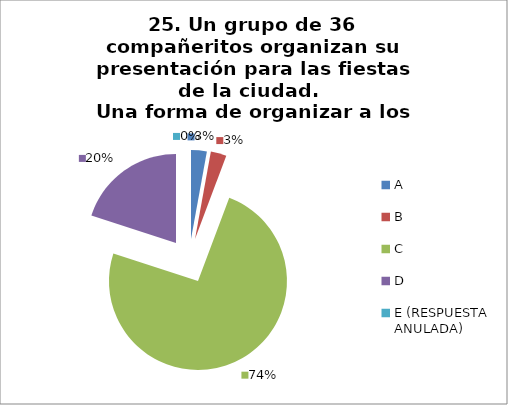
| Category | CANTIDAD DE RESPUESTAS PREGUNTA (25) | PORCENTAJE |
|---|---|---|
| A | 1 | 0.029 |
| B | 1 | 0.029 |
| C | 26 | 0.743 |
| D | 7 | 0.2 |
| E (RESPUESTA ANULADA) | 0 | 0 |